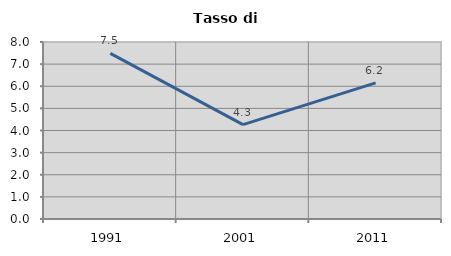
| Category | Tasso di disoccupazione   |
|---|---|
| 1991.0 | 7.483 |
| 2001.0 | 4.268 |
| 2011.0 | 6.154 |